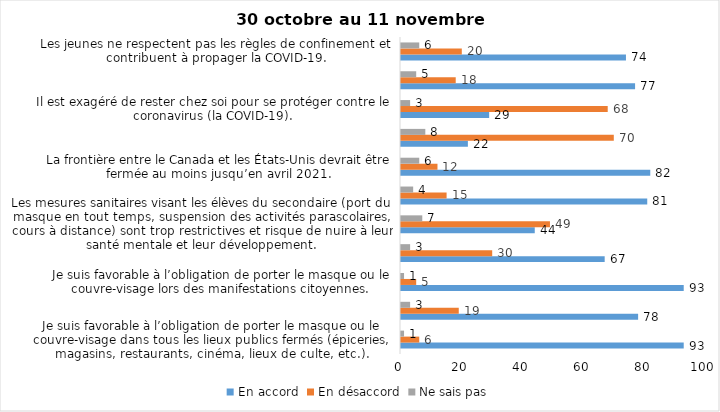
| Category | En accord | En désaccord | Ne sais pas |
|---|---|---|---|
| Je suis favorable à l’obligation de porter le masque ou le couvre-visage dans tous les lieux publics fermés (épiceries, magasins, restaurants, cinéma, lieux de culte, etc.). | 93 | 6 | 1 |
| C’est une bonne chose que les policiers puissent donner facilement des contraventions aux gens qui ne respectent pas les mesures pour prévenir le coronavirus (la COVID-19). | 78 | 19 | 3 |
| Je suis favorable à l’obligation de porter le masque ou le couvre-visage lors des manifestations citoyennes. | 93 | 5 | 1 |
| C’est une bonne chose d’arrêter les activités sportives de groupe (ex. hockey, soccer, yoga, etc.) et de fermer les centres d’entraînement (gyms) dans les zones rouges. | 67 | 30 | 3 |
| Les mesures sanitaires visant les élèves du secondaire (port du masque en tout temps, suspension des activités parascolaires, cours à distance) sont trop restrictives et risque de nuire à leur santé mentale et leur développement. | 44 | 49 | 7 |
| Je suis favorable à l’obligation de porter le masque ou le couvre-visage en tout temps pour les élèves au secondaire. | 81 | 15 | 4 |
| La frontière entre le Canada et les États-Unis devrait être fermée au moins jusqu’en avril 2021. | 82 | 12 | 6 |
| Le gouvernement et les médias exagèrent par rapport au coronavirus (la COVID-19). | 22 | 70 | 8 |
| Il est exagéré de rester chez soi pour se protéger contre le coronavirus (la COVID-19). | 29 | 68 | 3 |
| J’ai peur que le système de santé soit débordé par les cas de COVID-19 suite au «déconfinement». | 77 | 18 | 5 |
| Les jeunes ne respectent pas les règles de confinement et contribuent à propager la COVID-19. | 74 | 20 | 6 |